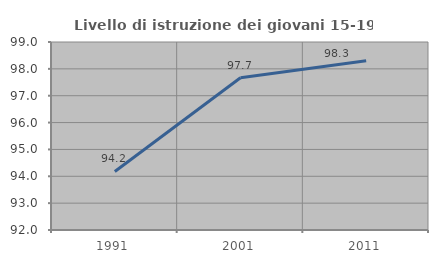
| Category | Livello di istruzione dei giovani 15-19 anni |
|---|---|
| 1991.0 | 94.181 |
| 2001.0 | 97.671 |
| 2011.0 | 98.305 |